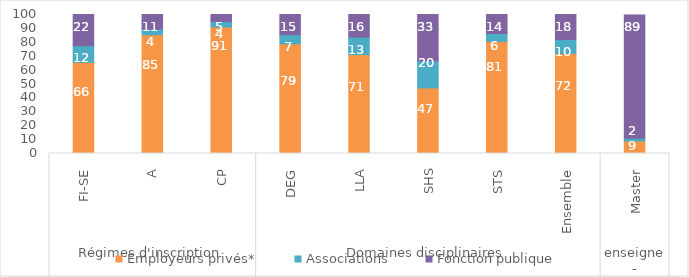
| Category | Employeurs privés* | Associations | Fonction publique |
|---|---|---|---|
| 0 | 65.6 | 11.93 | 22.47 |
| 1 | 85.41 | 4.09 | 10.5 |
| 2 | 91.02 | 3.89 | 5.08 |
| 3 | 78.89 | 6.57 | 14.54 |
| 4 | 71.13 | 12.63 | 16.24 |
| 5 | 47.19 | 19.6 | 33.21 |
| 6 | 80.63 | 5.68 | 13.69 |
| 7 | 72 | 10 | 18 |
| 8 | 9 | 2 | 88.69 |